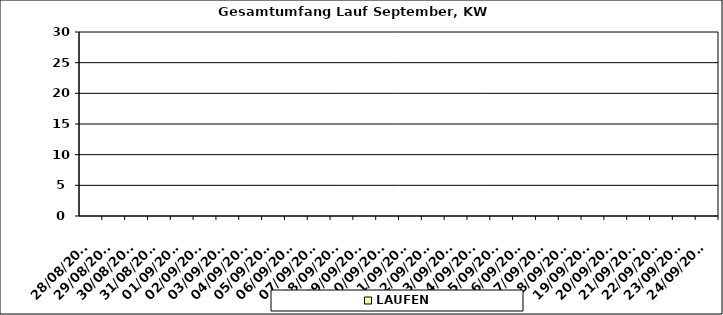
| Category | LAUFEN |
|---|---|
| 28/08/2023 | 0 |
| 29/08/2023 | 0 |
| 30/08/2023 | 0 |
| 31/08/2023 | 0 |
| 01/09/2023 | 0 |
| 02/09/2023 | 0 |
| 03/09/2023 | 0 |
| 04/09/2023 | 0 |
| 05/09/2023 | 0 |
| 06/09/2023 | 0 |
| 07/09/2023 | 0 |
| 08/09/2023 | 0 |
| 09/09/2023 | 0 |
| 10/09/2023 | 0 |
| 11/09/2023 | 0 |
| 12/09/2023 | 0 |
| 13/09/2023 | 0 |
| 14/09/2023 | 0 |
| 15/09/2023 | 0 |
| 16/09/2023 | 0 |
| 17/09/2023 | 0 |
| 18/09/2023 | 0 |
| 19/09/2023 | 0 |
| 20/09/2023 | 0 |
| 21/09/2023 | 0 |
| 22/09/2023 | 0 |
| 23/09/2023 | 0 |
| 24/09/2023 | 0 |